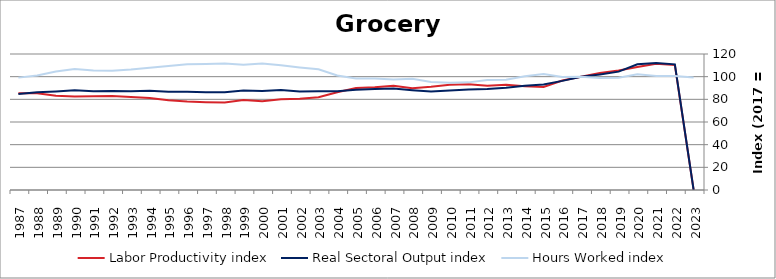
| Category | Labor Productivity index | Real Sectoral Output index | Hours Worked index |
|---|---|---|---|
| 2023.0 | 0 | 0 | 99.197 |
| 2022.0 | 110.184 | 110.893 | 100.644 |
| 2021.0 | 111.432 | 112.004 | 100.514 |
| 2020.0 | 108.569 | 110.972 | 102.214 |
| 2019.0 | 105.419 | 104.44 | 99.071 |
| 2018.0 | 103.143 | 101.949 | 98.843 |
| 2017.0 | 100 | 100 | 100 |
| 2016.0 | 96.671 | 96.301 | 99.617 |
| 2015.0 | 90.937 | 93.1 | 102.378 |
| 2014.0 | 91.624 | 92.041 | 100.455 |
| 2013.0 | 92.765 | 90.3 | 97.343 |
| 2012.0 | 91.912 | 89.126 | 96.97 |
| 2011.0 | 93.273 | 88.576 | 94.965 |
| 2010.0 | 92.817 | 87.843 | 94.641 |
| 2009.0 | 91.07 | 86.806 | 95.318 |
| 2008.0 | 89.768 | 88.048 | 98.084 |
| 2007.0 | 91.91 | 89.516 | 97.395 |
| 2006.0 | 90.721 | 89.223 | 98.349 |
| 2005.0 | 89.926 | 88.409 | 98.312 |
| 2004.0 | 86.282 | 87.122 | 100.974 |
| 2003.0 | 81.843 | 87.136 | 106.466 |
| 2002.0 | 80.492 | 86.994 | 108.078 |
| 2001.0 | 80.118 | 88.165 | 110.044 |
| 2000.0 | 78.414 | 87.445 | 111.518 |
| 1999.0 | 79.434 | 87.747 | 110.465 |
| 1998.0 | 77.178 | 86.201 | 111.691 |
| 1997.0 | 77.519 | 86.253 | 111.266 |
| 1996.0 | 78.096 | 86.587 | 110.871 |
| 1995.0 | 79.21 | 86.596 | 109.325 |
| 1994.0 | 81.148 | 87.471 | 107.792 |
| 1993.0 | 81.958 | 87.115 | 106.292 |
| 1992.0 | 82.992 | 87.316 | 105.211 |
| 1991.0 | 82.647 | 87.071 | 105.353 |
| 1990.0 | 82.536 | 88.045 | 106.676 |
| 1989.0 | 83.17 | 86.966 | 104.565 |
| 1988.0 | 85.362 | 86.244 | 101.034 |
| 1987.0 | 85.356 | 84.63 | 99.149 |